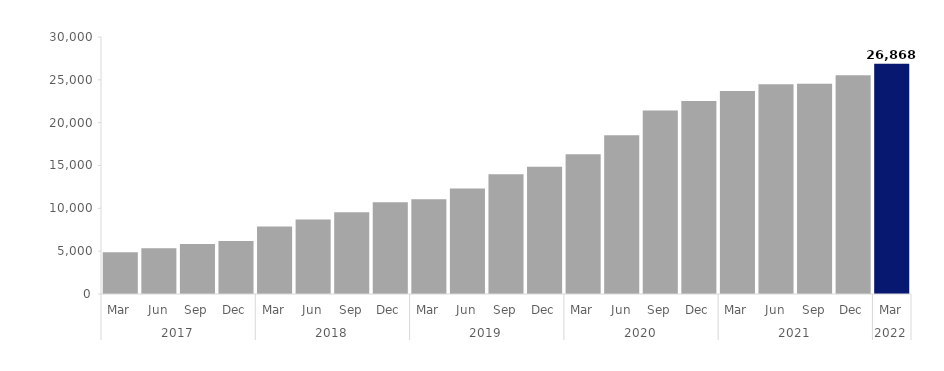
| Category | Series 0 |
|---|---|
| 0 | 4866 |
| 1 | 5352 |
| 2 | 5844 |
| 3 | 6180 |
| 4 | 7890 |
| 5 | 8703 |
| 6 | 9537 |
| 7 | 10713 |
| 8 | 11067 |
| 9 | 12309 |
| 10 | 13965 |
| 11 | 14868 |
| 12 | 16308 |
| 13 | 18522 |
| 14 | 21414 |
| 15 | 22521 |
| 16 | 23688 |
| 17 | 24474 |
| 18 | 24546 |
| 19 | 25524 |
| 20 | 26868 |